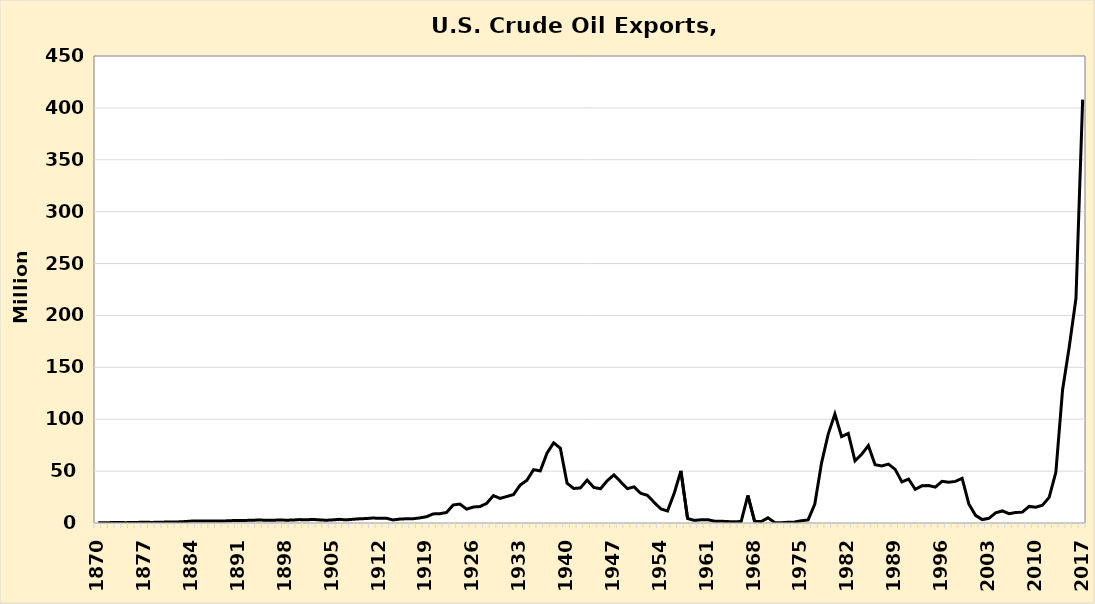
| Category | Series 0 |
|---|---|
| 1870.0 | 0.248 |
| 1871.0 | 0.269 |
| 1872.0 | 0.39 |
| 1873.0 | 0.468 |
| 1874.0 | 0.344 |
| 1875.0 | 0.394 |
| 1876.0 | 0.603 |
| 1877.0 | 0.685 |
| 1878.0 | 0.573 |
| 1879.0 | 0.681 |
| 1880.0 | 0.875 |
| 1881.0 | 0.963 |
| 1882.0 | 1.072 |
| 1883.0 | 1.405 |
| 1884.0 | 1.897 |
| 1885.0 | 1.939 |
| 1886.0 | 1.818 |
| 1887.0 | 1.92 |
| 1888.0 | 1.846 |
| 1889.0 | 2.028 |
| 1890.0 | 2.299 |
| 1891.0 | 2.303 |
| 1892.0 | 2.486 |
| 1893.0 | 2.66 |
| 1894.0 | 2.903 |
| 1895.0 | 2.65 |
| 1896.0 | 2.641 |
| 1897.0 | 2.893 |
| 1898.0 | 2.736 |
| 1899.0 | 2.802 |
| 1900.0 | 3.29 |
| 1901.0 | 3.024 |
| 1902.0 | 3.458 |
| 1903.0 | 3.012 |
| 1904.0 | 2.647 |
| 1905.0 | 3.004 |
| 1906.0 | 3.525 |
| 1907.0 | 3.007 |
| 1908.0 | 3.552 |
| 1909.0 | 4.056 |
| 1910.0 | 4.288 |
| 1911.0 | 4.806 |
| 1912.0 | 4.493 |
| 1913.0 | 4.63 |
| 1914.0 | 2.969 |
| 1915.0 | 3.768 |
| 1916.0 | 4.096 |
| 1917.0 | 4.098 |
| 1918.0 | 4.901 |
| 1919.0 | 6.019 |
| 1920.0 | 8.757 |
| 1921.0 | 8.94 |
| 1922.0 | 10.163 |
| 1923.0 | 17.385 |
| 1924.0 | 18.239 |
| 1925.0 | 13.337 |
| 1926.0 | 15.407 |
| 1927.0 | 15.844 |
| 1928.0 | 18.966 |
| 1929.0 | 26.401 |
| 1930.0 | 23.705 |
| 1931.0 | 25.535 |
| 1932.0 | 27.393 |
| 1933.0 | 36.584 |
| 1934.0 | 41.127 |
| 1935.0 | 51.378 |
| 1936.0 | 50.184 |
| 1937.0 | 67.286 |
| 1938.0 | 77.273 |
| 1939.0 | 72.073 |
| 1940.0 | 38.341 |
| 1941.0 | 33.238 |
| 1942.0 | 33.834 |
| 1943.0 | 41.342 |
| 1944.0 | 34.238 |
| 1945.0 | 32.998 |
| 1946.0 | 40.75 |
| 1947.0 | 46.355 |
| 1948.0 | 39.736 |
| 1949.0 | 33.069 |
| 1950.0 | 34.823 |
| 1951.0 | 28.604 |
| 1952.0 | 26.696 |
| 1953.0 | 19.931 |
| 1954.0 | 13.599 |
| 1955.0 | 11.571 |
| 1956.0 | 28.624 |
| 1957.0 | 50.243 |
| 1958.0 | 4.346 |
| 1959.0 | 2.526 |
| 1960.0 | 3.087 |
| 1961.0 | 3.227 |
| 1962.0 | 1.79 |
| 1963.0 | 1.698 |
| 1964.0 | 1.363 |
| 1965.0 | 1.097 |
| 1966.0 | 1.477 |
| 1967.0 | 26.541 |
| 1968.0 | 1.802 |
| 1969.0 | 1.436 |
| 1970.0 | 4.991 |
| 1971.0 | 0.503 |
| 1972.0 | 0.187 |
| 1973.0 | 0.697 |
| 1974.0 | 1.074 |
| 1975.0 | 2.146 |
| 1976.0 | 2.941 |
| 1977.0 | 18.255 |
| 1978.0 | 57.728 |
| 1979.0 | 85.707 |
| 1980.0 | 104.935 |
| 1981.0 | 83.166 |
| 1982.0 | 86.279 |
| 1983.0 | 59.948 |
| 1984.0 | 66.233 |
| 1985.0 | 74.513 |
| 1986.0 | 56.205 |
| 1987.0 | 54.964 |
| 1988.0 | 56.713 |
| 1989.0 | 51.683 |
| 1990.0 | 39.653 |
| 1991.0 | 42.385 |
| 1992.0 | 32.473 |
| 1993.0 | 35.834 |
| 1994.0 | 36.02 |
| 1995.0 | 34.509 |
| 1996.0 | 40.211 |
| 1997.0 | 39.308 |
| 1998.0 | 40.102 |
| 1999.0 | 43.031 |
| 2000.0 | 18.352 |
| 2001.0 | 7.386 |
| 2002.0 | 3.296 |
| 2003.0 | 4.538 |
| 2004.0 | 9.783 |
| 2005.0 | 11.619 |
| 2006.0 | 8.999 |
| 2007.0 | 10.006 |
| 2008.0 | 10.464 |
| 2009.0 | 15.985 |
| 2010.0 | 15.198 |
| 2011.0 | 17.158 |
| 2012.0 | 24.693 |
| 2013.0 | 48.968 |
| 2014.0 | 128.233 |
| 2015.0 | 169.741 |
| 2016.0 | 216.274 |
| 2017.0 | 407.989 |